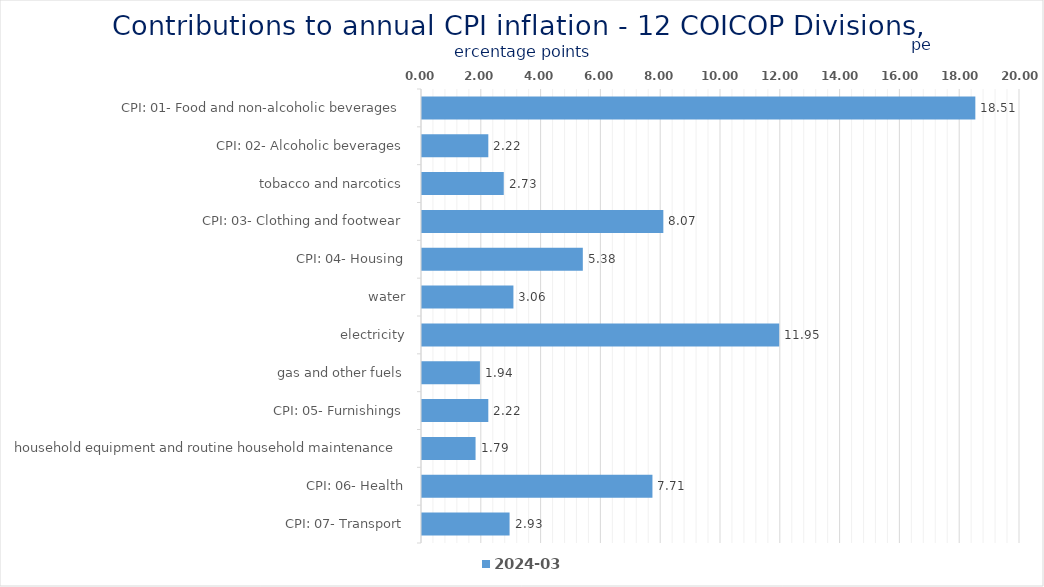
| Category | 2024-03 |
|---|---|
| CPI: 01- Food and non-alcoholic beverages | 18.506 |
| CPI: 02- Alcoholic beverages, tobacco and narcotics | 2.218 |
| CPI: 03- Clothing and footwear | 2.734 |
| CPI: 04- Housing, water, electricity, gas and other fuels | 8.071 |
| CPI: 05- Furnishings, household equipment and routine household maintenance | 5.379 |
| CPI: 06- Health | 3.057 |
| CPI: 07- Transport | 11.946 |
| CPI: 08- Communication | 1.938 |
| CPI: 09- Recreation and culture | 2.218 |
| CPI: 10- Education | 1.791 |
| CPI: 11- Restaurants and hotels | 7.707 |
| CPI: 12- Miscellaneous goods and services | 2.929 |